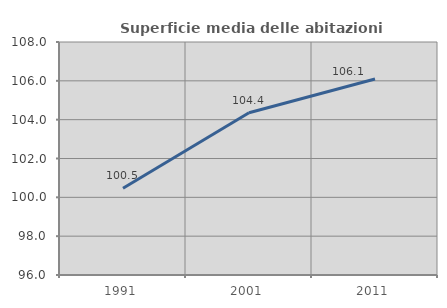
| Category | Superficie media delle abitazioni occupate |
|---|---|
| 1991.0 | 100.464 |
| 2001.0 | 104.356 |
| 2011.0 | 106.093 |